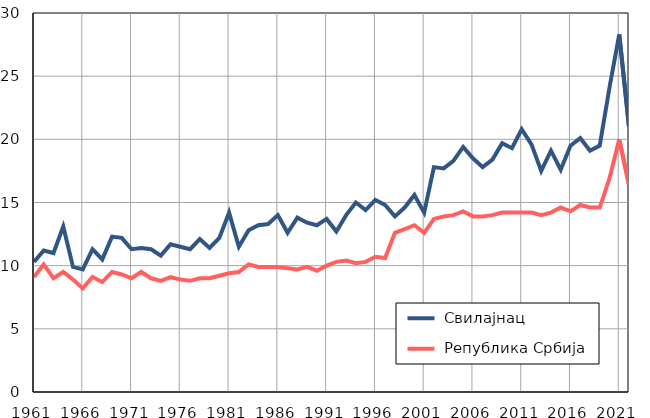
| Category |  Свилајнац |  Република Србија |
|---|---|---|
| 1961.0 | 10.3 | 9.1 |
| 1962.0 | 11.2 | 10.1 |
| 1963.0 | 11 | 9 |
| 1964.0 | 13.1 | 9.5 |
| 1965.0 | 9.9 | 8.9 |
| 1966.0 | 9.7 | 8.2 |
| 1967.0 | 11.3 | 9.1 |
| 1968.0 | 10.5 | 8.7 |
| 1969.0 | 12.3 | 9.5 |
| 1970.0 | 12.2 | 9.3 |
| 1971.0 | 11.3 | 9 |
| 1972.0 | 11.4 | 9.5 |
| 1973.0 | 11.3 | 9 |
| 1974.0 | 10.8 | 8.8 |
| 1975.0 | 11.7 | 9.1 |
| 1976.0 | 11.5 | 8.9 |
| 1977.0 | 11.3 | 8.8 |
| 1978.0 | 12.1 | 9 |
| 1979.0 | 11.4 | 9 |
| 1980.0 | 12.2 | 9.2 |
| 1981.0 | 14.2 | 9.4 |
| 1982.0 | 11.5 | 9.5 |
| 1983.0 | 12.8 | 10.1 |
| 1984.0 | 13.2 | 9.9 |
| 1985.0 | 13.3 | 9.9 |
| 1986.0 | 14 | 9.9 |
| 1987.0 | 12.6 | 9.8 |
| 1988.0 | 13.8 | 9.7 |
| 1989.0 | 13.4 | 9.9 |
| 1990.0 | 13.2 | 9.6 |
| 1991.0 | 13.7 | 10 |
| 1992.0 | 12.7 | 10.3 |
| 1993.0 | 14 | 10.4 |
| 1994.0 | 15 | 10.2 |
| 1995.0 | 14.4 | 10.3 |
| 1996.0 | 15.2 | 10.7 |
| 1997.0 | 14.8 | 10.6 |
| 1998.0 | 13.9 | 12.6 |
| 1999.0 | 14.6 | 12.9 |
| 2000.0 | 15.6 | 13.2 |
| 2001.0 | 14.2 | 12.6 |
| 2002.0 | 17.8 | 13.7 |
| 2003.0 | 17.7 | 13.9 |
| 2004.0 | 18.3 | 14 |
| 2005.0 | 19.4 | 14.3 |
| 2006.0 | 18.5 | 13.9 |
| 2007.0 | 17.8 | 13.9 |
| 2008.0 | 18.4 | 14 |
| 2009.0 | 19.7 | 14.2 |
| 2010.0 | 19.3 | 14.2 |
| 2011.0 | 20.8 | 14.2 |
| 2012.0 | 19.6 | 14.2 |
| 2013.0 | 17.5 | 14 |
| 2014.0 | 19.1 | 14.2 |
| 2015.0 | 17.6 | 14.6 |
| 2016.0 | 19.5 | 14.3 |
| 2017.0 | 20.1 | 14.8 |
| 2018.0 | 19.1 | 14.6 |
| 2019.0 | 19.5 | 14.6 |
| 2020.0 | 24.1 | 16.9 |
| 2021.0 | 28.3 | 20 |
| 2022.0 | 21 | 16.4 |